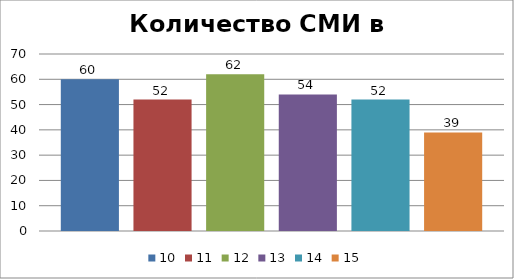
| Category | 10 | 11 | 12 | 13 | 14 | 15 |
|---|---|---|---|---|---|---|
| 0 | 60 | 52 | 62 | 54 | 52 | 39 |